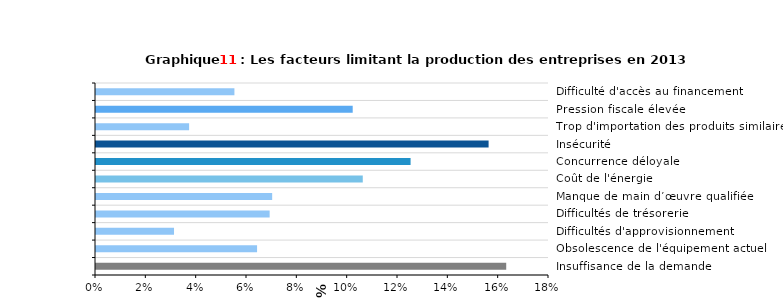
| Category | Ensemble |
|---|---|
| Insuffisance de la demande  | 0.163 |
| Obsolescence de l'équipement actuel  | 0.064 |
| Difficultés d'approvisionnement  | 0.031 |
| Difficultés de trésorerie  | 0.069 |
| Manque de main d’œuvre qualifiée  | 0.07 |
| Coût de l'énergie  | 0.106 |
| Concurrence déloyale  | 0.125 |
| Insécurité  | 0.156 |
| Trop d'importation des produits similaires | 0.037 |
| Pression fiscale élevée | 0.102 |
| Difficulté d'accès au financement | 0.055 |